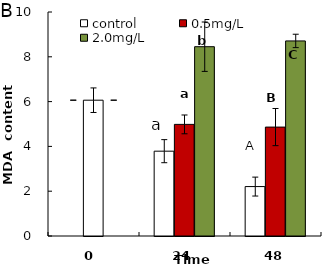
| Category | control | 0.5mg/L | 2.0mg/L |
|---|---|---|---|
| 0.0 | 6.062 | 6.062 | 6.062 |
| 24.0 | 3.787 | 4.983 | 8.451 |
| 48.0 | 2.206 | 4.862 | 8.709 |